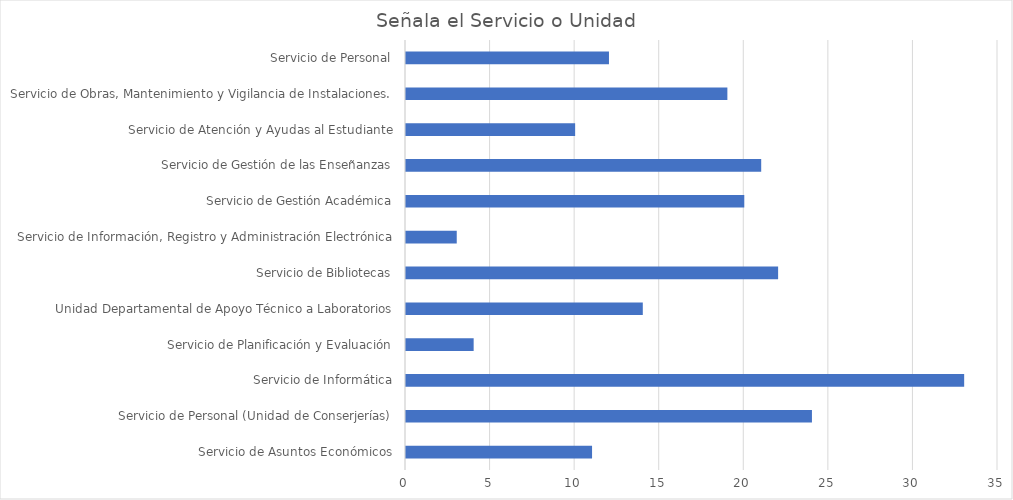
| Category | Series 4 |
|---|---|
| Servicio de Asuntos Económicos | 11 |
| Servicio de Personal (Unidad de Conserjerías) | 24 |
| Servicio de Informática | 33 |
| Servicio de Planificación y Evaluación | 4 |
| Unidad Departamental de Apoyo Técnico a Laboratorios | 14 |
| Servicio de Bibliotecas | 22 |
| Servicio de Información, Registro y Administración Electrónica | 3 |
| Servicio de Gestión Académica | 20 |
| Servicio de Gestión de las Enseñanzas | 21 |
| Servicio de Atención y Ayudas al Estudiante | 10 |
| Servicio de Obras, Mantenimiento y Vigilancia de Instalaciones. | 19 |
| Servicio de Personal | 12 |